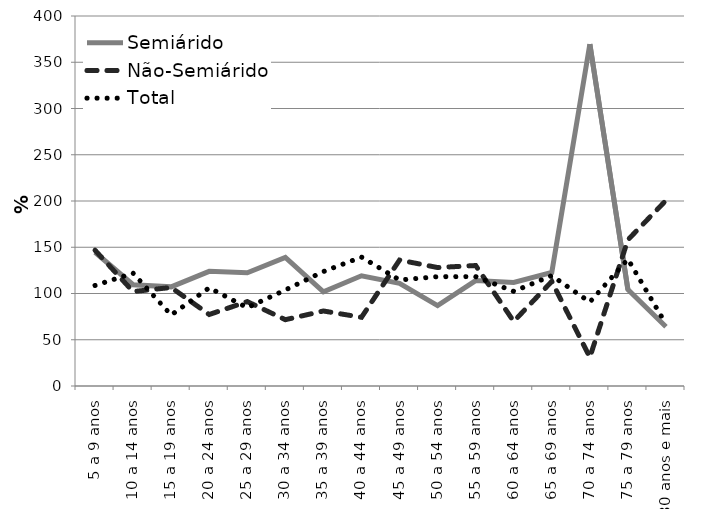
| Category | Semiárido | Não-Semiárido | Total |
|---|---|---|---|
| 5 a 9 anos | 144.597 | 146.792 | 108.68 |
| 10 a 14 anos | 109.48 | 102.098 | 121.99 |
| 15 a 19 anos | 107.179 | 106.519 | 76.75 |
| 20 a 24 anos | 123.964 | 77.298 | 106.139 |
| 25 a 29 anos | 122.358 | 91.232 | 84.719 |
| 30 a 34 anos | 139.069 | 71.684 | 103.815 |
| 35 a 39 anos | 101.907 | 81.091 | 123.722 |
| 40 a 44 anos | 119.162 | 74.268 | 139.376 |
| 45 a 49 anos | 111.07 | 136.155 | 114.629 |
| 50 a 54 anos | 86.977 | 128.072 | 118.181 |
| 55 a 59 anos | 113.98 | 130.232 | 118.224 |
| 60 a 64 anos | 111.85 | 69.82 | 102.301 |
| 65 a 69 anos | 122.746 | 113.051 | 119.3 |
| 70 a 74 anos | 369.671 | 30.987 | 90.746 |
| 75 a 79 anos | 104.202 | 158.052 | 137.115 |
| 80 anos e mais | 63.991 | 200.624 | 66.876 |